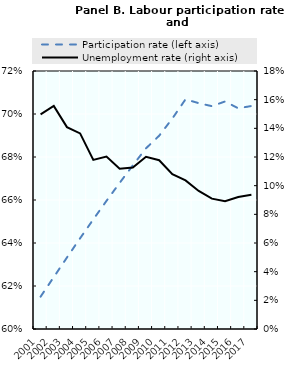
| Category | Participation rate (left axis) |
|---|---|
| 2001.0 | 0.615 |
| 2002.0 | 0.624 |
| 2003.0 | 0.633 |
| 2004.0 | 0.642 |
| 2005.0 | 0.651 |
| 2006.0 | 0.66 |
| 2007.0 | 0.668 |
| 2008.0 | 0.676 |
| 2009.0 | 0.684 |
| 2010.0 | 0.69 |
| 2011.0 | 0.698 |
| 2012.0 | 0.707 |
| 2013.0 | 0.705 |
| 2014.0 | 0.704 |
| 2015.0 | 0.706 |
| 2016.0 | 0.703 |
| 2017.0 | 0.704 |